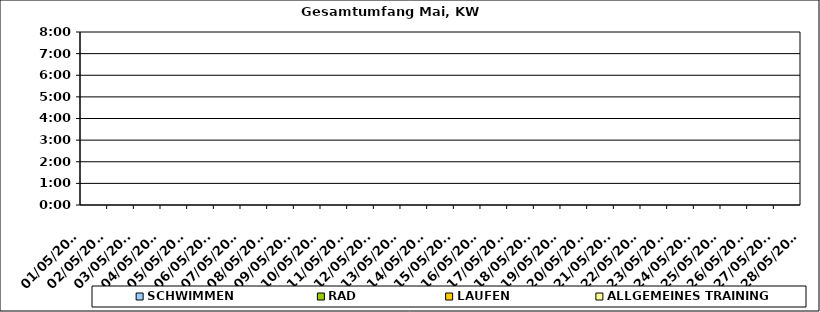
| Category | SCHWIMMEN | RAD | LAUFEN | ALLGEMEINES TRAINING |
|---|---|---|---|---|
| 01/05/2023 |  |  |  | 0 |
| 02/05/2023 |  |  |  | 0 |
| 03/05/2023 |  |  |  | 0 |
| 04/05/2023 |  |  |  | 0 |
| 05/05/2023 |  |  |  | 0 |
| 06/05/2023 |  |  |  | 0 |
| 07/05/2023 |  |  |  | 0 |
| 08/05/2023 |  |  |  | 0 |
| 09/05/2023 |  |  |  | 0 |
| 10/05/2023 |  |  |  | 0 |
| 11/05/2023 |  |  |  | 0 |
| 12/05/2023 |  |  |  | 0 |
| 13/05/2023 |  |  |  | 0 |
| 14/05/2023 |  |  |  | 0 |
| 15/05/2023 |  |  |  | 0 |
| 16/05/2023 |  |  |  | 0 |
| 17/05/2023 |  |  |  | 0 |
| 18/05/2023 |  |  |  | 0 |
| 19/05/2023 |  |  |  | 0 |
| 20/05/2023 |  |  |  | 0 |
| 21/05/2023 |  |  |  | 0 |
| 22/05/2023 |  |  |  | 0 |
| 23/05/2023 |  |  |  | 0 |
| 24/05/2023 |  |  |  | 0 |
| 25/05/2023 |  |  |  | 0 |
| 26/05/2023 |  |  |  | 0 |
| 27/05/2023 |  |  |  | 0 |
| 28/05/2023 |  |  |  | 0 |